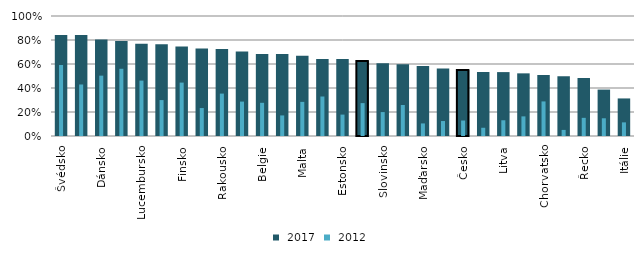
| Category |  2017 |
|---|---|
| Švédsko | 0.841 |
| Nizozemsko | 0.841 |
| Dánsko | 0.805 |
| Velká Británie | 0.792 |
| Lucembursko | 0.768 |
| Španělsko | 0.764 |
| Finsko | 0.746 |
| Německo | 0.729 |
| Rakousko | 0.724 |
| Irsko | 0.705 |
| Belgie | 0.683 |
| Kypr | 0.683 |
| Malta | 0.668 |
| Francie | 0.642 |
| Estonsko | 0.642 |
| EU28 průměr | 0.626 |
| Slovinsko | 0.605 |
| Slovensko | 0.598 |
| Maďarsko | 0.584 |
| Portugalsko | 0.563 |
| Česko | 0.549 |
| Bulharsko | 0.534 |
| Litva | 0.533 |
| Lotyšsko | 0.522 |
| Chorvatsko | 0.508 |
| Rumunsko | 0.498 |
| Řecko | 0.483 |
| Polsko | 0.387 |
| Itálie | 0.313 |